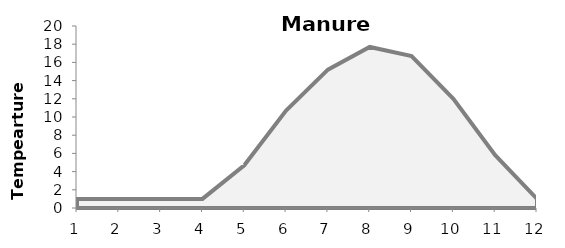
| Category | Series 1 |
|---|---|
| 0 | 1 |
| 1 | 1 |
| 2 | 1 |
| 3 | 1 |
| 4 | 4.7 |
| 5 | 10.7 |
| 6 | 15.2 |
| 7 | 17.7 |
| 8 | 16.7 |
| 9 | 12 |
| 10 | 5.8 |
| 11 | 1 |